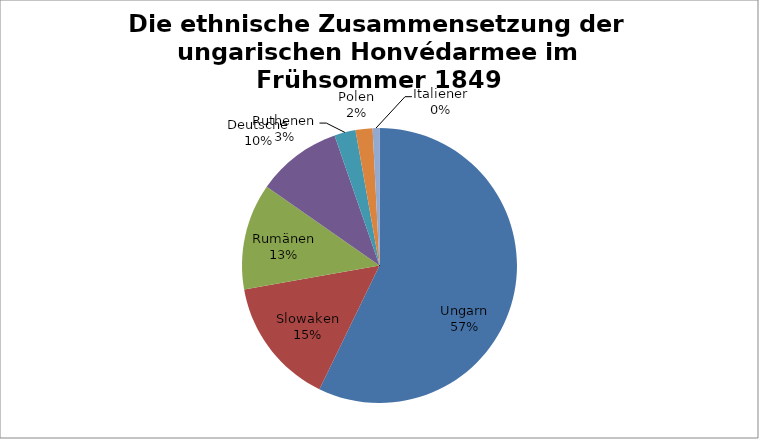
| Category | Truppenstärke der ungarischen Honvédarmee im Frühsommer 1849 |
|---|---|
| Ungarn | 114400 |
| Slowaken | 30000 |
| Rumänen | 25000 |
| Deutsche | 20000 |
| Ruthenen | 5000 |
| Polen | 4000 |
| Italiener | 1600 |